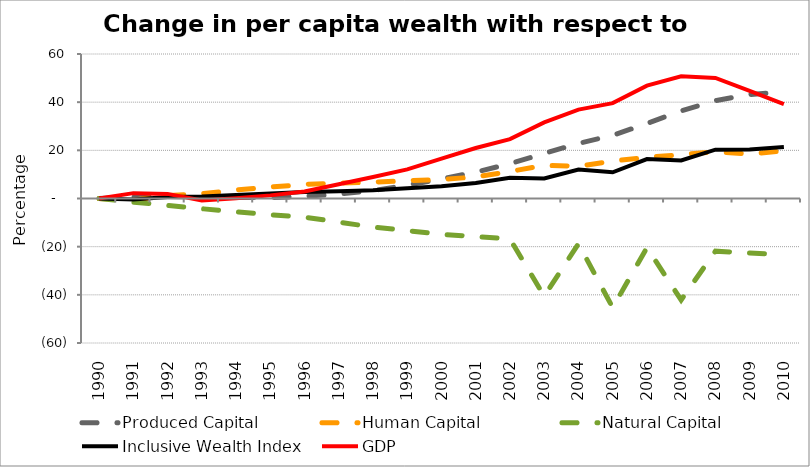
| Category | Produced Capital  | Human Capital | Natural Capital | Inclusive Wealth Index | GDP |
|---|---|---|---|---|---|
| 1990.0 | 0 | 0 | 0 | 0 | 0 |
| 1991.0 | 0.632 | -0.68 | -1.537 | -0.409 | 2.228 |
| 1992.0 | 0.835 | 1.186 | -2.834 | 0.574 | 1.909 |
| 1993.0 | 0.695 | 1.97 | -4.244 | 0.811 | -0.805 |
| 1994.0 | 0.4 | 3.532 | -5.501 | 1.477 | 0.128 |
| 1995.0 | 0.389 | 4.744 | -6.73 | 2.026 | 1.294 |
| 1996.0 | 0.888 | 5.873 | -7.736 | 2.701 | 2.885 |
| 1997.0 | 1.804 | 6.369 | -9.81 | 2.991 | 5.935 |
| 1998.0 | 3.331 | 6.805 | -11.879 | 3.425 | 8.898 |
| 1999.0 | 5.496 | 7.399 | -13.321 | 4.215 | 12.076 |
| 2000.0 | 8.11 | 7.87 | -14.913 | 5.044 | 16.569 |
| 2001.0 | 10.966 | 8.967 | -15.794 | 6.398 | 20.96 |
| 2002.0 | 14.432 | 11.211 | -16.832 | 8.579 | 24.657 |
| 2003.0 | 18.732 | 13.792 | -40.553 | 8.314 | 31.618 |
| 2004.0 | 22.865 | 13.411 | -18.766 | 12.057 | 36.92 |
| 2005.0 | 26.21 | 15.528 | -45.309 | 10.886 | 39.594 |
| 2006.0 | 31.142 | 17.104 | -20.416 | 16.397 | 46.856 |
| 2007.0 | 36.383 | 18.18 | -42.123 | 15.782 | 50.767 |
| 2008.0 | 40.644 | 19.387 | -21.874 | 20.293 | 50.049 |
| 2009.0 | 43.175 | 18.459 | -22.628 | 20.388 | 44.726 |
| 2010.0 | 44.317 | 19.791 | -23.412 | 21.396 | 39.234 |